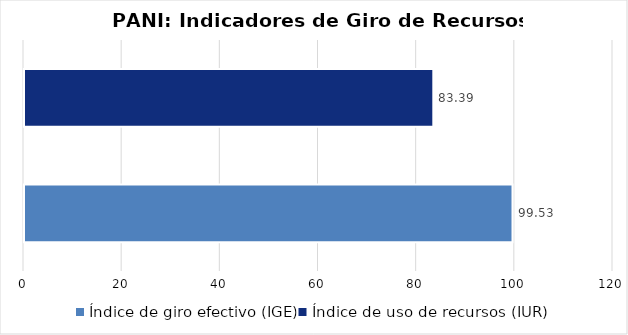
| Category | Total programa |
|---|---|
| Índice de giro efectivo (IGE) | 99.525 |
| Índice de uso de recursos (IUR)  | 83.391 |